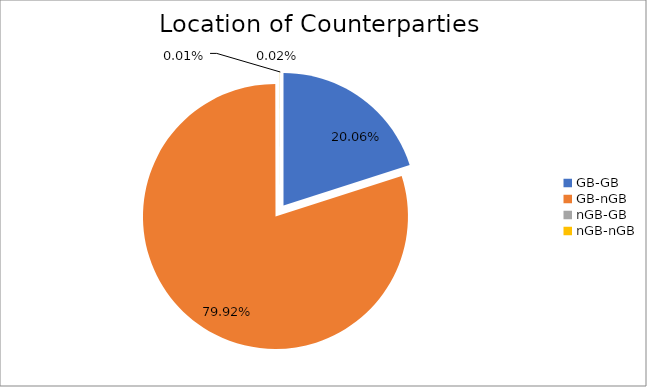
| Category | Series 0 |
|---|---|
| GB-GB | 1847174.746 |
| GB-nGB | 7360264.926 |
| nGB-GB | 885.796 |
| nGB-nGB | 1504.245 |